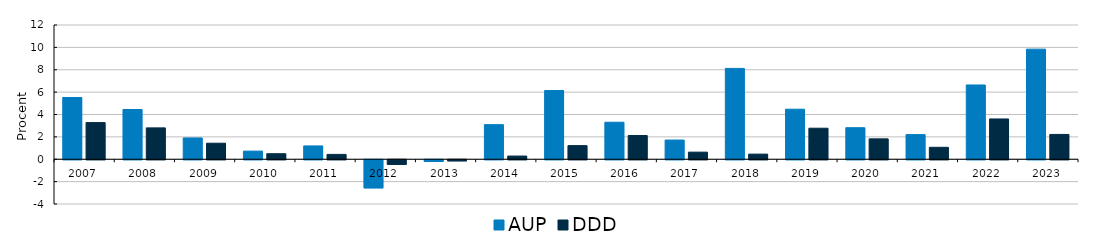
| Category | AUP | DDD |
|---|---|---|
| 2007 | 5.52 | 3.275 |
| 2008 | 4.445 | 2.804 |
| 2009 | 1.905 | 1.434 |
| 2010 | 0.727 | 0.496 |
| 2011 | 1.19 | 0.433 |
| 2012 | -2.514 | -0.413 |
| 2013 | -0.158 | -0.097 |
| 2014 | 3.093 | 0.286 |
| 2015 | 6.142 | 1.219 |
| 2016 | 3.308 | 2.121 |
| 2017 | 1.718 | 0.635 |
| 2018 | 8.119 | 0.459 |
| 2019 | 4.473 | 2.774 |
| 2020 | 2.82 | 1.821 |
| 2021 | 2.203 | 1.068 |
| 2022 | 6.641 | 3.602 |
| 2023 | 9.844 | 2.219 |